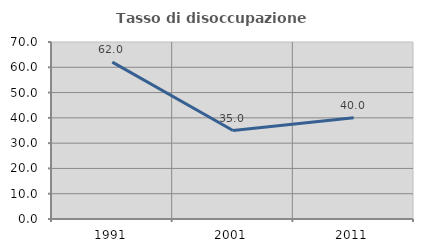
| Category | Tasso di disoccupazione giovanile  |
|---|---|
| 1991.0 | 62.037 |
| 2001.0 | 35 |
| 2011.0 | 40 |